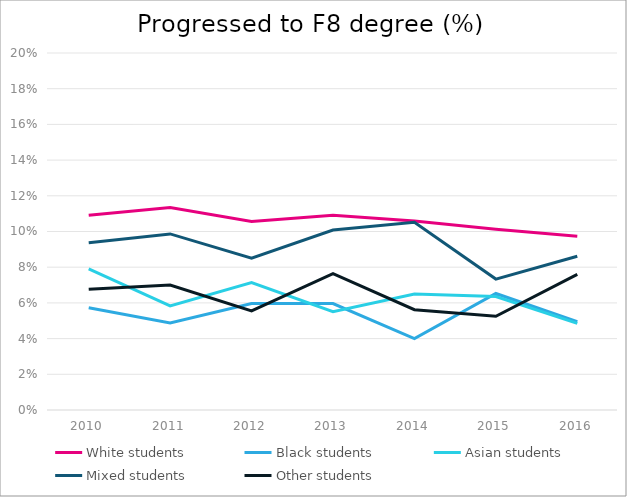
| Category | White students | Black students | Asian students | Mixed students | Other students |
|---|---|---|---|---|---|
| 2010.0 | 0.109 | 0.057 | 0.079 | 0.094 | 0.068 |
| 2011.0 | 0.113 | 0.049 | 0.058 | 0.099 | 0.07 |
| 2012.0 | 0.106 | 0.06 | 0.071 | 0.085 | 0.056 |
| 2013.0 | 0.109 | 0.06 | 0.055 | 0.101 | 0.076 |
| 2014.0 | 0.106 | 0.04 | 0.065 | 0.105 | 0.056 |
| 2015.0 | 0.101 | 0.065 | 0.064 | 0.073 | 0.052 |
| 2016.0 | 0.097 | 0.049 | 0.049 | 0.086 | 0.076 |